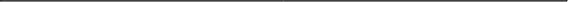
| Category | Доля пред-ий с РП < 0% | Доля предп-ий с 0<РП<20% | Доля пред-ий с 20%<РП<40% | Доля предп-ий с РП > 40% |
|---|---|---|---|---|
| 2 кв 2008 | 15.637 | 39.64 | 22.716 | 22.008 |
| 3 кв | 16.511 | 38.692 | 23.988 | 20.623 |
| 4 кв | 18.615 | 40.012 | 22.882 | 18.429 |
| 1 кв 2009 | 20.383 | 37.678 | 20.568 | 21.062 |